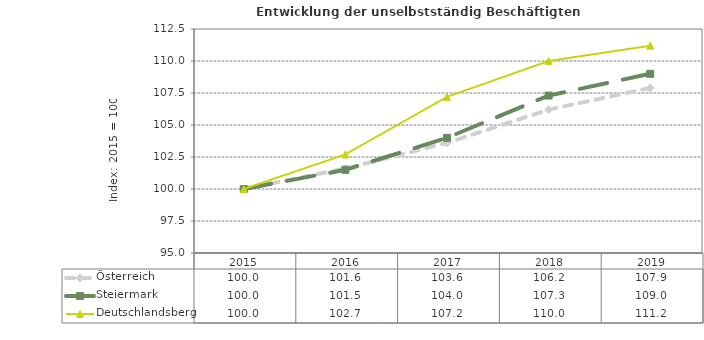
| Category | Österreich | Steiermark | Deutschlandsberg |
|---|---|---|---|
| 2019.0 | 107.9 | 109 | 111.2 |
| 2018.0 | 106.2 | 107.3 | 110 |
| 2017.0 | 103.6 | 104 | 107.2 |
| 2016.0 | 101.6 | 101.5 | 102.7 |
| 2015.0 | 100 | 100 | 100 |